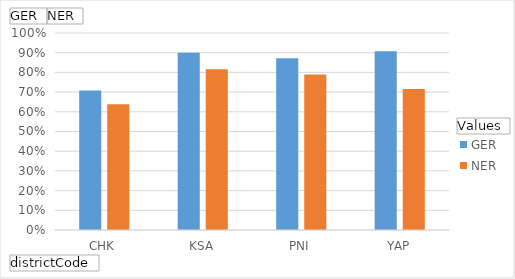
| Category | GER | NER |
|---|---|---|
| CHK | 0.708 | 0.639 |
| KSA | 0.9 | 0.816 |
| PNI | 0.872 | 0.789 |
| YAP | 0.907 | 0.715 |